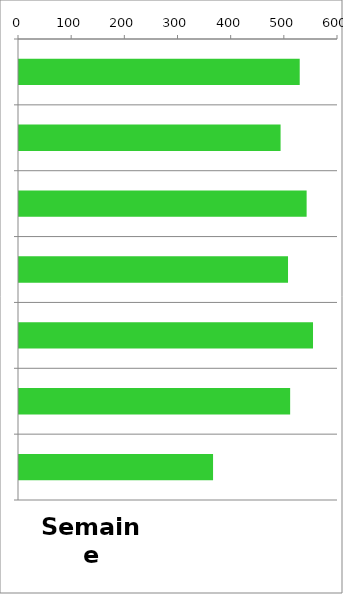
| Category | TV |
|---|---|
| 0 | 528 |
| 1 | 492 |
| 2 | 541 |
| 3 | 506 |
| 4 | 553 |
| 5 | 510 |
| 6 | 365 |